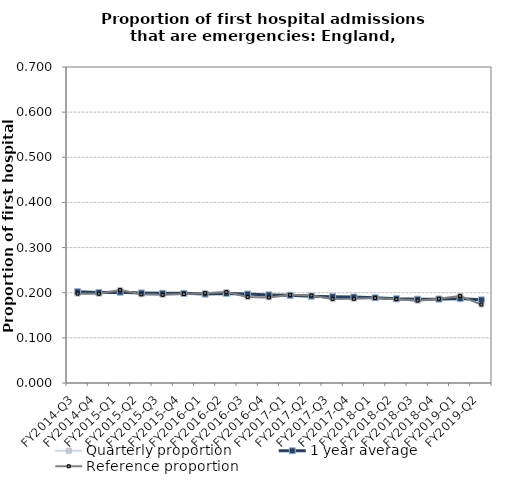
| Category | Quarterly proportion | 1 year average | Reference proportion |
|---|---|---|---|
| FY2014-Q3 | 0.198 | 0.202 | 0.198 |
| FY2014-Q4 | 0.198 | 0.201 | 0.198 |
| FY2015-Q1 | 0.206 | 0.201 | 0.206 |
| FY2015-Q2 | 0.196 | 0.199 | 0.196 |
| FY2015-Q3 | 0.195 | 0.199 | 0.195 |
| FY2015-Q4 | 0.197 | 0.199 | 0.197 |
| FY2016-Q1 | 0.199 | 0.197 | 0.199 |
| FY2016-Q2 | 0.201 | 0.198 | 0.201 |
| FY2016-Q3 | 0.191 | 0.197 | 0.191 |
| FY2016-Q4 | 0.19 | 0.195 | 0.19 |
| FY2017-Q1 | 0.195 | 0.194 | 0.195 |
| FY2017-Q2 | 0.194 | 0.192 | 0.194 |
| FY2017-Q3 | 0.186 | 0.191 | 0.186 |
| FY2017-Q4 | 0.187 | 0.191 | 0.187 |
| FY2018-Q1 | 0.188 | 0.189 | 0.188 |
| FY2018-Q2 | 0.186 | 0.187 | 0.186 |
| FY2018-Q3 | 0.182 | 0.186 | 0.182 |
| FY2018-Q4 | 0.187 | 0.186 | 0.187 |
| FY2019-Q1 | 0.193 | 0.187 | 0.193 |
| FY2019-Q2 | 0.174 | 0.184 | 0.174 |